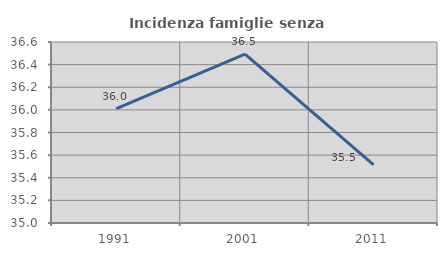
| Category | Incidenza famiglie senza nuclei |
|---|---|
| 1991.0 | 36.01 |
| 2001.0 | 36.493 |
| 2011.0 | 35.514 |